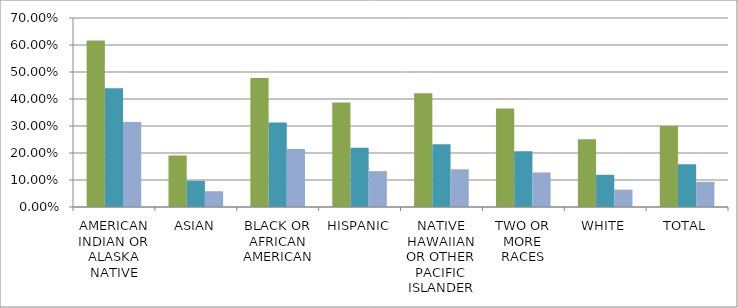
| Category | % STUDENTS WITH MORE THAN 10 DAYS TOTAL ABSENCES | % STUDENTS WITH MORE THAN 15 DAYS TOTAL ABSENCES | % STUDENTS WITH MORE THAN 20 DAYS TOTAL ABSENCES |
|---|---|---|---|
| AMERICAN INDIAN OR ALASKA NATIVE | 0.616 | 0.44 | 0.314 |
| ASIAN | 0.19 | 0.097 | 0.058 |
| BLACK OR AFRICAN AMERICAN | 0.478 | 0.313 | 0.215 |
| HISPANIC | 0.387 | 0.219 | 0.133 |
| NATIVE HAWAIIAN OR OTHER PACIFIC ISLANDER | 0.421 | 0.232 | 0.14 |
| TWO OR MORE RACES | 0.365 | 0.206 | 0.128 |
| WHITE | 0.251 | 0.119 | 0.064 |
| TOTAL | 0.3 | 0.158 | 0.093 |